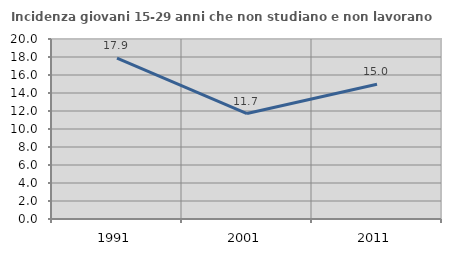
| Category | Incidenza giovani 15-29 anni che non studiano e non lavorano  |
|---|---|
| 1991.0 | 17.864 |
| 2001.0 | 11.721 |
| 2011.0 | 14.975 |